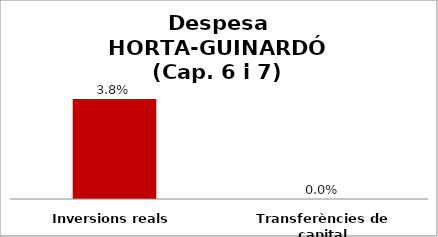
| Category | Series 0 |
|---|---|
| Inversions reals | 0.038 |
| Transferències de capital | 0 |